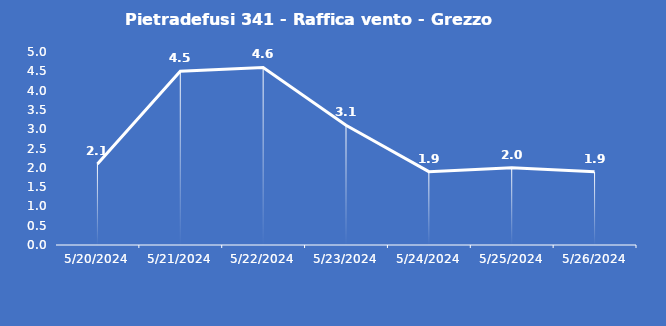
| Category | Pietradefusi 341 - Raffica vento - Grezzo (m/s) |
|---|---|
| 5/20/24 | 2.1 |
| 5/21/24 | 4.5 |
| 5/22/24 | 4.6 |
| 5/23/24 | 3.1 |
| 5/24/24 | 1.9 |
| 5/25/24 | 2 |
| 5/26/24 | 1.9 |